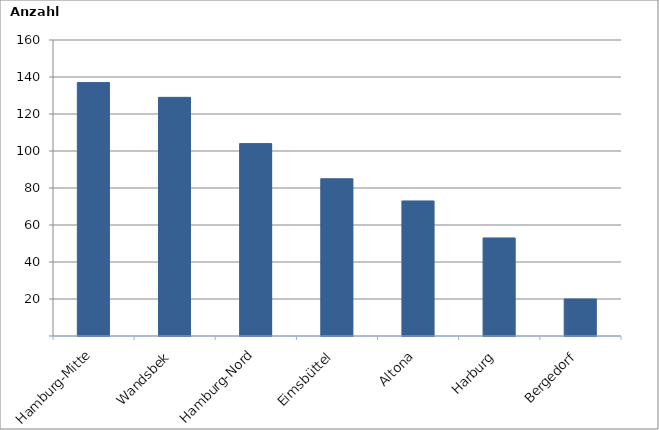
| Category | Series 0 |
|---|---|
| Hamburg-Mitte | 137 |
| Wandsbek | 129 |
| Hamburg-Nord | 104 |
| Eimsbüttel | 85 |
| Altona | 73 |
| Harburg | 53 |
| Bergedorf | 20 |